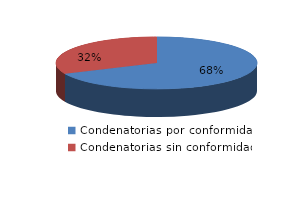
| Category | Series 0 |
|---|---|
| 0 | 264 |
| 1 | 123 |